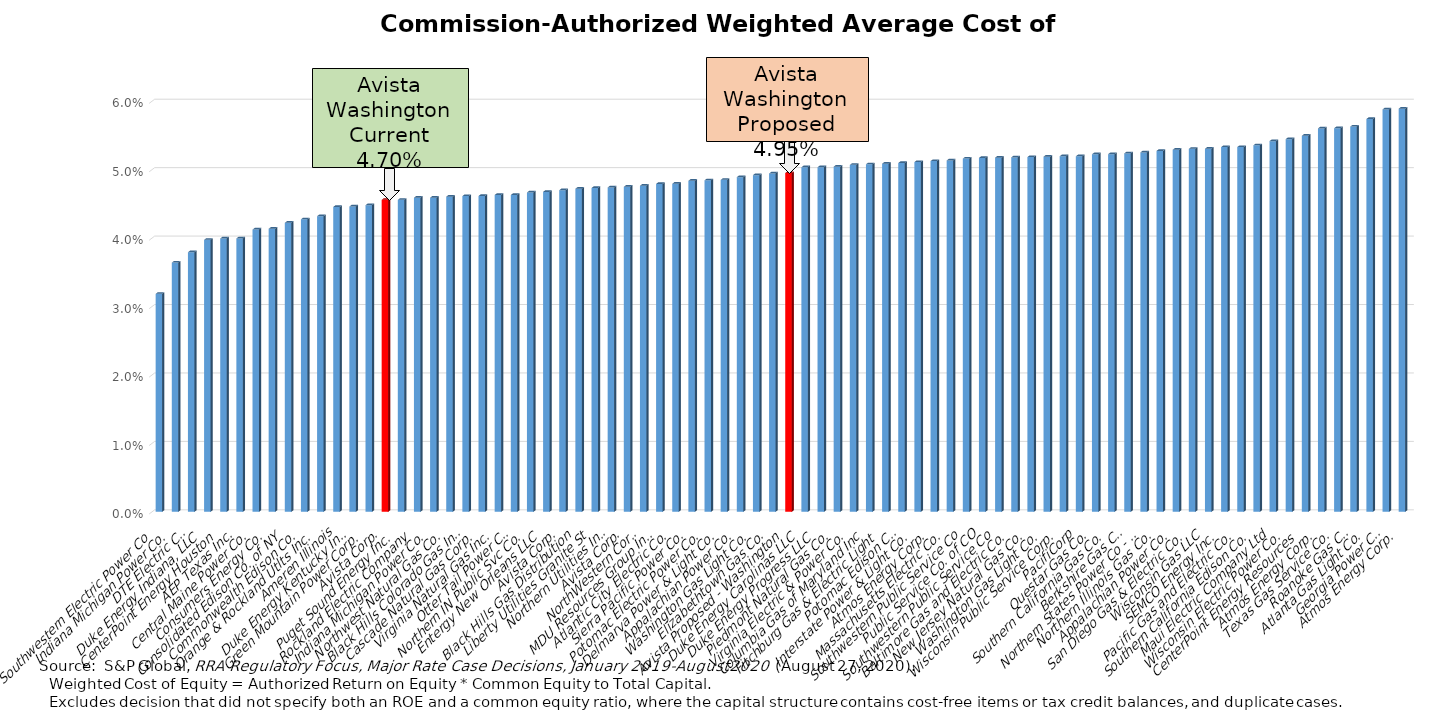
| Category | Series 0 |
|---|---|
| Southwestern Electric Power Co | 0.032 |
| Indiana Michigan Power Co. | 0.036 |
| DTE Electric Co. | 0.038 |
| Duke Energy Indiana, LLC | 0.04 |
| CenterPoint Energy Houston | 0.04 |
| AEP Texas Inc. | 0.04 |
| Central Maine Power Co. | 0.041 |
| Consumers Energy Co. | 0.041 |
| Consolidated Edison Co. of NY | 0.042 |
| Commonwealth Edison Co. | 0.043 |
| Orange & Rockland Utlts Inc. | 0.043 |
| Ameren Illinois | 0.045 |
| Duke Energy Kentucky Inc. | 0.045 |
| Green Mountain Power Corp. | 0.045 |
| Avista Corp. | 0.046 |
| Puget Sound Energy Inc. | 0.046 |
| Rockland Electric Company | 0.046 |
| Indiana Michigan Power Co. | 0.046 |
| Northwest Natural Gas Co. | 0.046 |
| Black Hills Colorado Gas Inc. | 0.046 |
| Cascade Natural Gas Corp. | 0.046 |
| Virginia Natural Gas Inc. | 0.046 |
| Otter Tail Power Co. | 0.046 |
| Northern IN Public Svc Co. | 0.047 |
| Entergy New Orleans LLC | 0.047 |
| Avista Corp. | 0.047 |
| Black Hills Gas Distribution | 0.047 |
| Liberty Utilities Granite St | 0.047 |
| Northern Utilities Inc. | 0.047 |
| Avista Corp. | 0.048 |
| NorthWestern Corp. | 0.048 |
| MDU Resources Group Inc. | 0.048 |
| Atlantic City Electric Co. | 0.048 |
| Sierra Pacific Power Co. | 0.048 |
| Potomac Electric Power Co. | 0.048 |
| Delmarva Power & Light Co. | 0.049 |
| Appalachian Power Co. | 0.049 |
| Washington Gas Light Co. | 0.049 |
| Elizabethtown Gas Co. | 0.049 |
| Avista Proposed - Washington | 0.05 |
| Duke Energy Carolinas LLC | 0.05 |
| Duke Energy Progress LLC | 0.05 |
| Piedmont Natural Gas Co. | 0.05 |
| Virginia Electric & Power Co. | 0.051 |
| Columbia Gas of Maryland Inc | 0.051 |
| Fitchburg Gas & Electric Light | 0.051 |
| Potomac Edison Co. | 0.051 |
| Interstate Power & Light Co. | 0.051 |
| Atmos Energy Corp. | 0.051 |
| Massachusetts Electric Co. | 0.051 |
| Southwestern Public Service Co | 0.052 |
| Public Service Co. of CO | 0.052 |
| Southwestern Public Service Co | 0.052 |
| Baltimore Gas and Electric Co. | 0.052 |
| New Jersey Natural Gas Co. | 0.052 |
| Washington Gas Light Co. | 0.052 |
| Wisconsin Public Service Corp. | 0.052 |
| PacifiCorp | 0.052 |
| Questar Gas Co. | 0.052 |
| Southern California Gas Co. | 0.052 |
| Berkshire Gas Co. | 0.052 |
| Northern States Power Co - WI | 0.053 |
| Northern Illinois Gas Co. | 0.053 |
| Appalachian Power Co. | 0.053 |
| San Diego Gas & Electric Co. | 0.053 |
| Wisconsin Gas LLC | 0.053 |
| SEMCO Energy Inc. | 0.053 |
| Pacific Gas and Electric Co. | 0.053 |
| Southern California Edison Co. | 0.054 |
| Maui Electric Company Ltd | 0.054 |
| Wisconsin Electric Power Co. | 0.054 |
| CenterPoint Energy Resources | 0.055 |
| Atmos Energy Corp. | 0.056 |
| Texas Gas Service Co. | 0.056 |
| Roanoke Gas Co. | 0.056 |
| Atlanta Gas Light Co. | 0.057 |
| Georgia Power Co. | 0.059 |
| Atmos Energy Corp. | 0.059 |